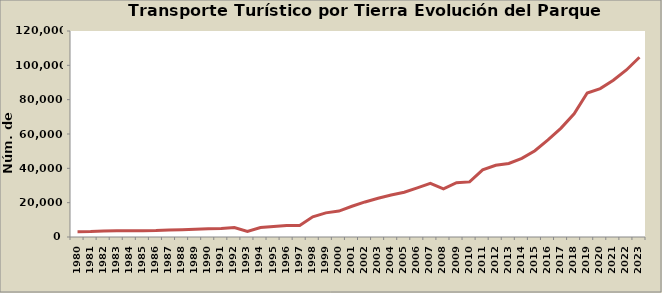
| Category | Series 0 |
|---|---|
| 1980.0 | 3070 |
| 1981.0 | 3150 |
| 1982.0 | 3550 |
| 1983.0 | 3589 |
| 1984.0 | 3596 |
| 1985.0 | 3674 |
| 1986.0 | 3718 |
| 1987.0 | 4127 |
| 1988.0 | 4266 |
| 1989.0 | 4476 |
| 1990.0 | 4782 |
| 1991.0 | 5005 |
| 1992.0 | 5481 |
| 1993.0 | 3240 |
| 1994.0 | 5476 |
| 1995.0 | 6137 |
| 1996.0 | 6706 |
| 1997.0 | 6729 |
| 1998.0 | 11793 |
| 1999.0 | 14048 |
| 2000.0 | 15124 |
| 2001.0 | 17889 |
| 2002.0 | 20424 |
| 2003.0 | 22561 |
| 2004.0 | 24419 |
| 2005.0 | 26044 |
| 2006.0 | 28579 |
| 2007.0 | 31203 |
| 2008.0 | 28008 |
| 2009.0 | 31619 |
| 2010.0 | 32105 |
| 2011.0 | 39093 |
| 2012.0 | 41813 |
| 2013.0 | 42836 |
| 2014.0 | 45817 |
| 2015.0 | 50284 |
| 2016.0 | 56598 |
| 2017.0 | 63420 |
| 2018.0 | 71716 |
| 2019.0 | 83855 |
| 2020.0 | 86440 |
| 2021.0 | 91303 |
| 2022.0 | 97303 |
| 2023.0 | 104689 |